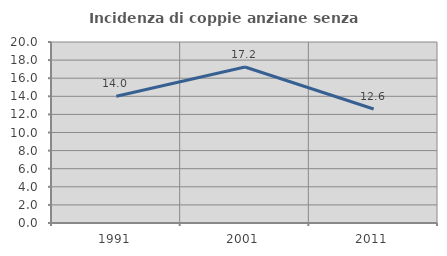
| Category | Incidenza di coppie anziane senza figli  |
|---|---|
| 1991.0 | 14 |
| 2001.0 | 17.241 |
| 2011.0 | 12.593 |